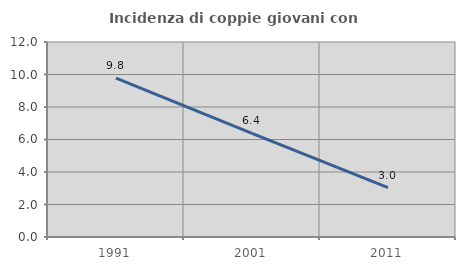
| Category | Incidenza di coppie giovani con figli |
|---|---|
| 1991.0 | 9.777 |
| 2001.0 | 6.375 |
| 2011.0 | 3.033 |